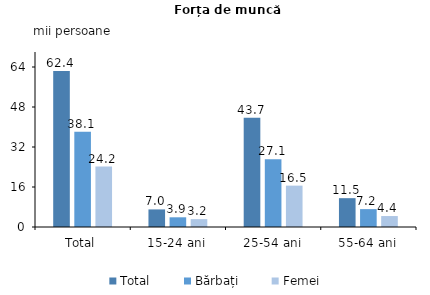
| Category | Total | Bărbați | Femei |
|---|---|---|---|
| Total | 62.4 | 38.1 | 24.2 |
| 15-24 ani | 7.032 | 3.88 | 3.152 |
| 25-54 ani | 43.65 | 27.105 | 16.545 |
| 55-64 ani | 11.532 | 7.15 | 4.382 |